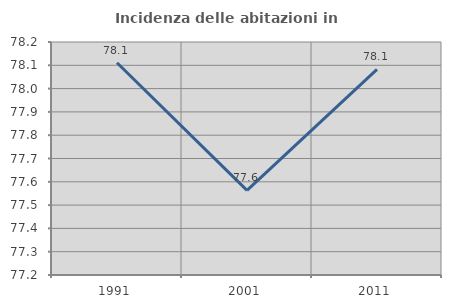
| Category | Incidenza delle abitazioni in proprietà  |
|---|---|
| 1991.0 | 78.111 |
| 2001.0 | 77.563 |
| 2011.0 | 78.083 |